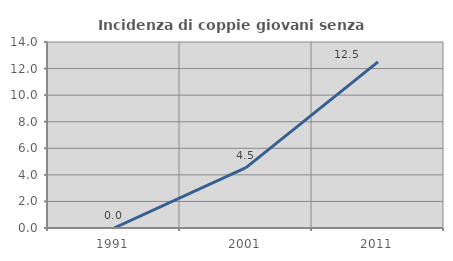
| Category | Incidenza di coppie giovani senza figli |
|---|---|
| 1991.0 | 0 |
| 2001.0 | 4.545 |
| 2011.0 | 12.5 |